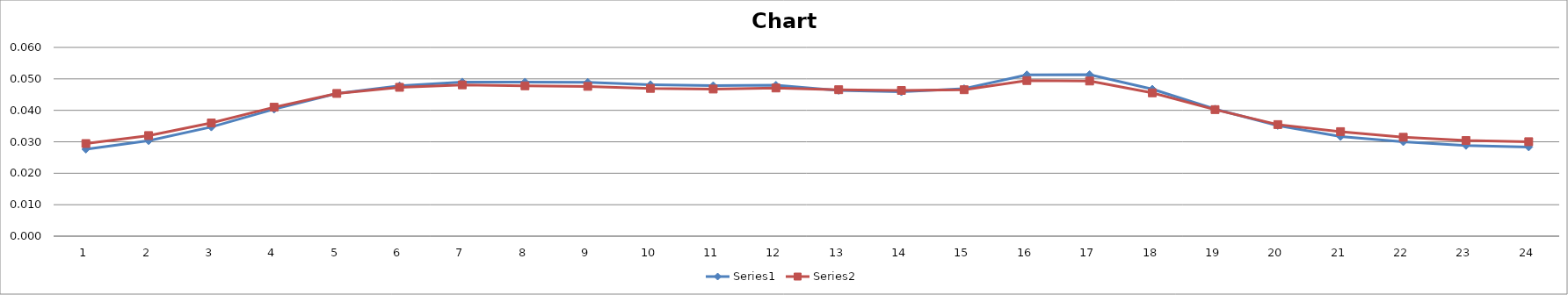
| Category | Series 0 | Series 1 |
|---|---|---|
| 0 | 0.028 | 0.029 |
| 1 | 0.03 | 0.032 |
| 2 | 0.035 | 0.036 |
| 3 | 0.04 | 0.041 |
| 4 | 0.045 | 0.045 |
| 5 | 0.048 | 0.047 |
| 6 | 0.049 | 0.048 |
| 7 | 0.049 | 0.048 |
| 8 | 0.049 | 0.048 |
| 9 | 0.048 | 0.047 |
| 10 | 0.048 | 0.047 |
| 11 | 0.048 | 0.047 |
| 12 | 0.046 | 0.047 |
| 13 | 0.046 | 0.046 |
| 14 | 0.047 | 0.047 |
| 15 | 0.051 | 0.049 |
| 16 | 0.051 | 0.049 |
| 17 | 0.047 | 0.046 |
| 18 | 0.04 | 0.04 |
| 19 | 0.035 | 0.035 |
| 20 | 0.032 | 0.033 |
| 21 | 0.03 | 0.031 |
| 22 | 0.029 | 0.03 |
| 23 | 0.028 | 0.03 |